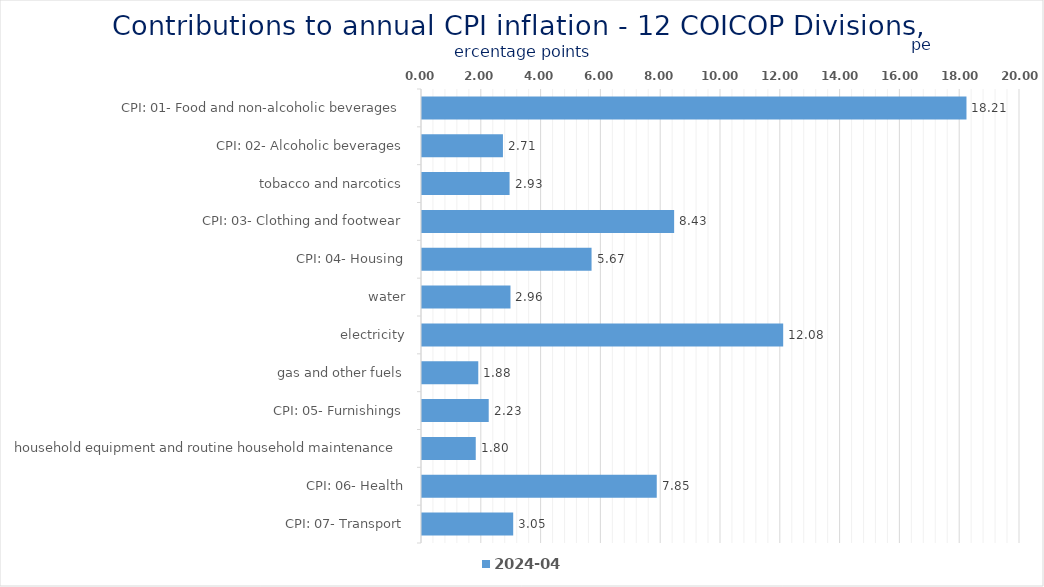
| Category | 2024-04 |
|---|---|
| CPI: 01- Food and non-alcoholic beverages | 18.21 |
| CPI: 02- Alcoholic beverages, tobacco and narcotics | 2.707 |
| CPI: 03- Clothing and footwear | 2.929 |
| CPI: 04- Housing, water, electricity, gas and other fuels | 8.433 |
| CPI: 05- Furnishings, household equipment and routine household maintenance | 5.671 |
| CPI: 06- Health | 2.959 |
| CPI: 07- Transport | 12.08 |
| CPI: 08- Communication | 1.882 |
| CPI: 09- Recreation and culture | 2.231 |
| CPI: 10- Education | 1.798 |
| CPI: 11- Restaurants and hotels | 7.851 |
| CPI: 12- Miscellaneous goods and services | 3.05 |